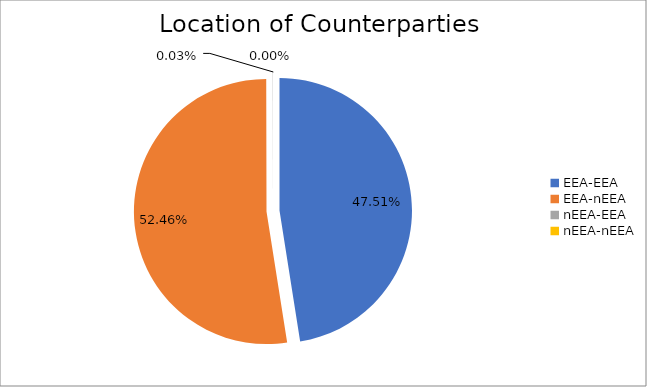
| Category | Series 0 |
|---|---|
| EEA-EEA | 6413993.03 |
| EEA-nEEA | 7082310.935 |
| nEEA-EEA | 4086.24 |
| nEEA-nEEA | 465.657 |